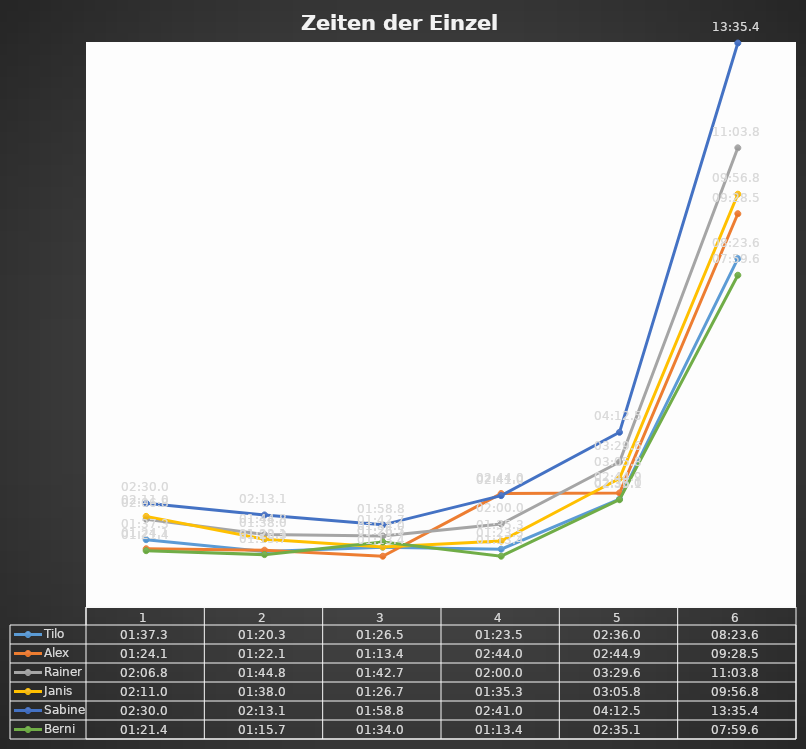
| Category | Tilo | Alex | Rainer | Janis | Sabine | Berni |
|---|---|---|---|---|---|---|
| 0 | 0.001 | 0.001 | 0.001 | 0.002 | 0.002 | 0.001 |
| 1 | 0.001 | 0.001 | 0.001 | 0.001 | 0.002 | 0.001 |
| 2 | 0.001 | 0.001 | 0.001 | 0.001 | 0.001 | 0.001 |
| 3 | 0.001 | 0.002 | 0.001 | 0.001 | 0.002 | 0.001 |
| 4 | 0.002 | 0.002 | 0.002 | 0.002 | 0.003 | 0.002 |
| 5 | 0.006 | 0.007 | 0.008 | 0.007 | 0.009 | 0.006 |